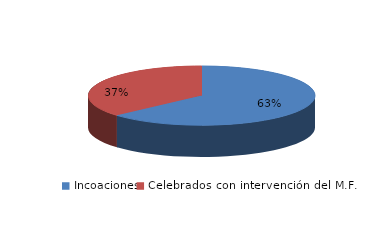
| Category | Series 0 |
|---|---|
| Incoaciones | 9444 |
| Celebrados con intervención del M.F. | 5458 |